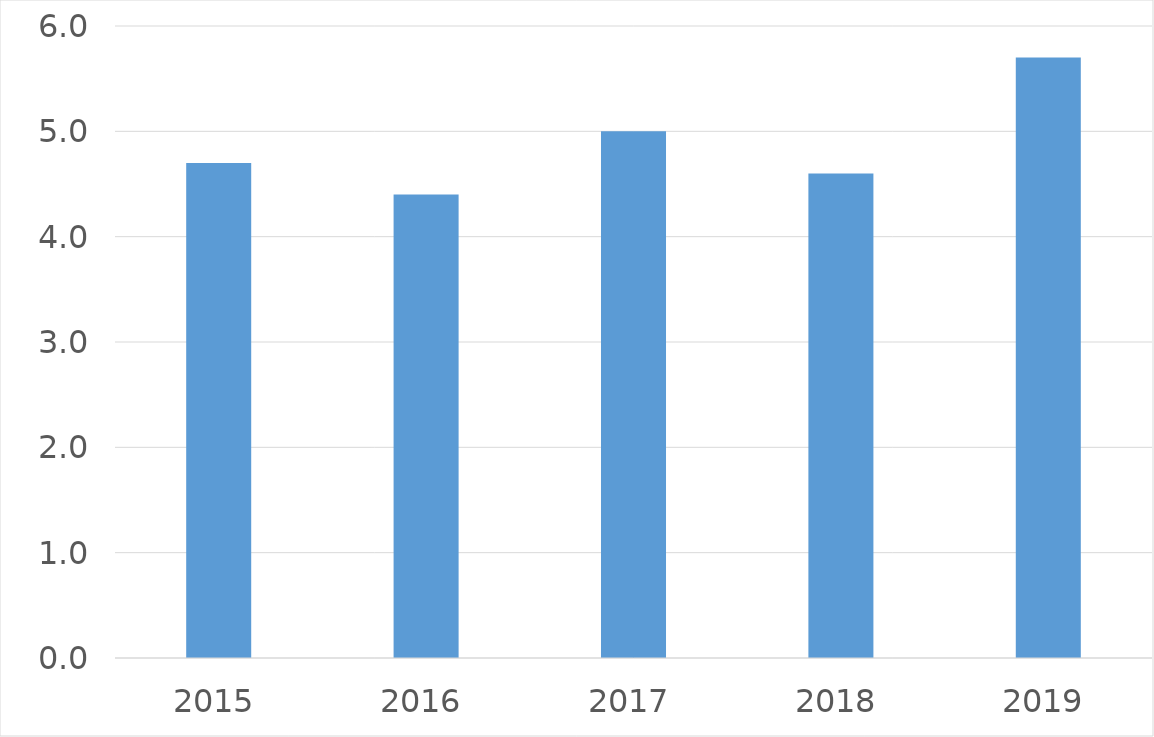
| Category | Series 0 |
|---|---|
| 2015 | 4.7 |
| 2016 | 4.4 |
| 2017 | 5 |
| 2018 | 4.6 |
| 2019 | 5.7 |